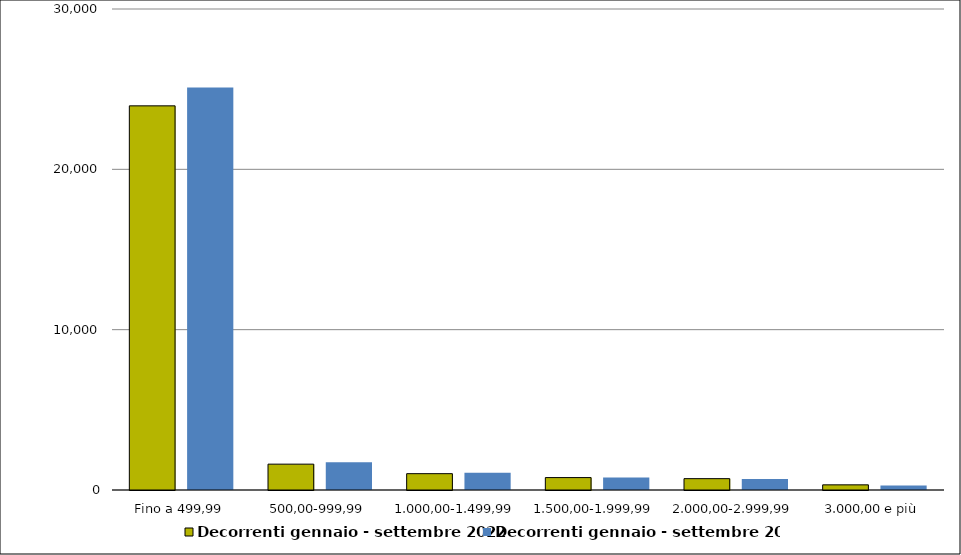
| Category | Decorrenti gennaio - settembre 2022 | Decorrenti gennaio - settembre 2021 |
|---|---|---|
| Fino a 499,99 | 23959 | 25099 |
| 500,00-999,99 | 1612 | 1735 |
| 1.000,00-1.499,99 | 1019 | 1075 |
| 1.500,00-1.999,99 | 774 | 777 |
| 2.000,00-2.999,99 | 708 | 685 |
| 3.000,00 e più | 321 | 277 |